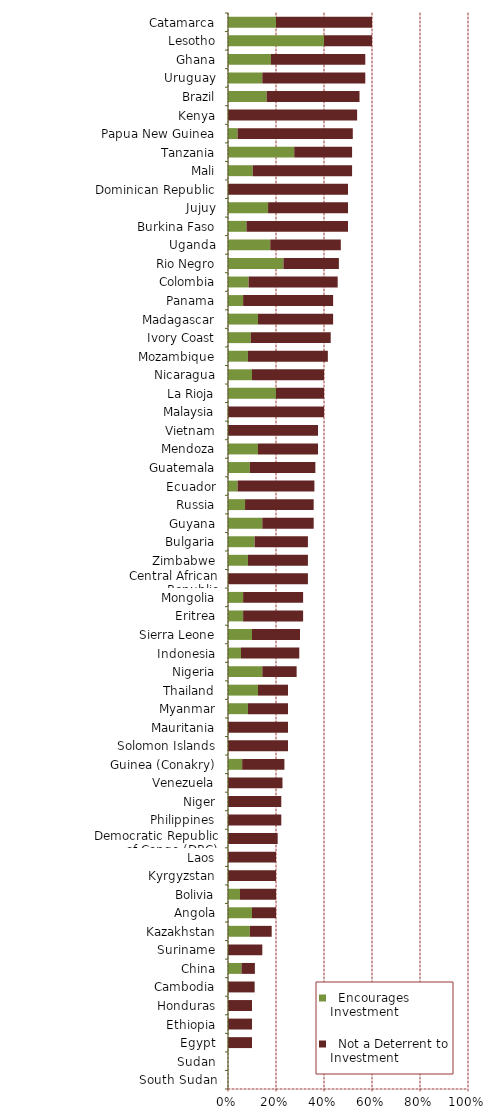
| Category |   Encourages Investment |   Not a Deterrent to Investment |
|---|---|---|
| South Sudan | 0 | 0 |
| Sudan | 0 | 0 |
| Egypt | 0 | 0.1 |
| Ethiopia | 0 | 0.1 |
| Honduras | 0 | 0.1 |
| Cambodia | 0 | 0.111 |
| China | 0.056 | 0.056 |
| Suriname | 0 | 0.143 |
| Kazakhstan | 0.091 | 0.091 |
| Angola | 0.1 | 0.1 |
| Bolivia | 0.05 | 0.15 |
| Kyrgyzstan | 0 | 0.2 |
| Laos | 0 | 0.2 |
| Democratic Republic of Congo (DRC) | 0 | 0.207 |
| Philippines | 0 | 0.222 |
| Niger | 0 | 0.222 |
| Venezuela | 0 | 0.227 |
| Guinea (Conakry) | 0.059 | 0.176 |
| Solomon Islands | 0 | 0.25 |
| Mauritania | 0 | 0.25 |
| Myanmar | 0.083 | 0.167 |
| Thailand | 0.125 | 0.125 |
| Nigeria | 0.143 | 0.143 |
| Indonesia | 0.054 | 0.243 |
| Sierra Leone | 0.1 | 0.2 |
| Eritrea | 0.063 | 0.25 |
| Mongolia | 0.063 | 0.25 |
| Central African Republic | 0 | 0.333 |
| Zimbabwe | 0.083 | 0.25 |
| Bulgaria | 0.111 | 0.222 |
| Guyana | 0.143 | 0.214 |
| Russia | 0.071 | 0.286 |
| Ecuador | 0.04 | 0.32 |
| Guatemala | 0.091 | 0.273 |
| Mendoza | 0.125 | 0.25 |
| Vietnam | 0 | 0.375 |
| Malaysia | 0 | 0.4 |
| La Rioja | 0.2 | 0.2 |
| Nicaragua | 0.1 | 0.3 |
| Mozambique | 0.083 | 0.333 |
| Ivory Coast | 0.095 | 0.333 |
| Madagascar | 0.125 | 0.313 |
| Panama | 0.063 | 0.375 |
| Colombia | 0.086 | 0.371 |
| Rio Negro | 0.231 | 0.231 |
| Uganda | 0.176 | 0.294 |
| Burkina Faso | 0.077 | 0.423 |
| Jujuy | 0.167 | 0.333 |
| Dominican Republic | 0 | 0.5 |
| Mali | 0.103 | 0.414 |
| Tanzania | 0.276 | 0.241 |
| Papua New Guinea | 0.04 | 0.48 |
| Kenya | 0 | 0.538 |
| Brazil | 0.161 | 0.387 |
| Uruguay | 0.143 | 0.429 |
| Ghana | 0.179 | 0.393 |
| Lesotho | 0.4 | 0.2 |
| Catamarca | 0.2 | 0.4 |